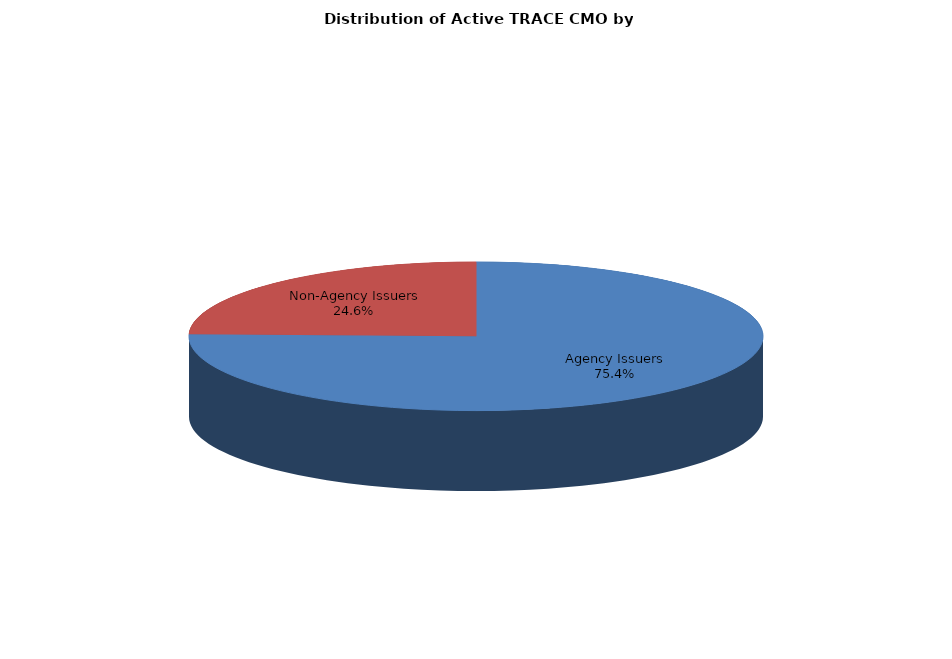
| Category | Series 0 |
|---|---|
| Agency Issuers | 180503 |
| Non-Agency Issuers | 58762 |